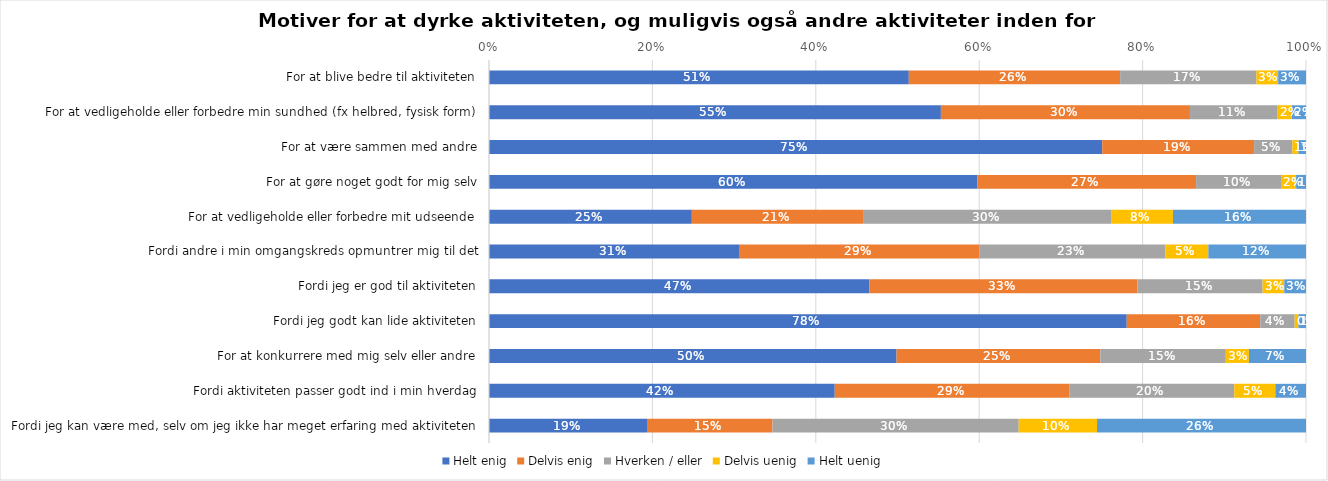
| Category | Helt enig | Delvis enig | Hverken / eller | Delvis uenig | Helt uenig |
|---|---|---|---|---|---|
| For at blive bedre til aktiviteten | 0.514 | 0.259 | 0.167 | 0.027 | 0.034 |
| For at vedligeholde eller forbedre min sundhed (fx helbred, fysisk form) | 0.553 | 0.305 | 0.107 | 0.017 | 0.017 |
| For at være sammen med andre | 0.751 | 0.186 | 0.047 | 0.008 | 0.009 |
| For at gøre noget godt for mig selv | 0.598 | 0.268 | 0.104 | 0.018 | 0.012 |
| For at vedligeholde eller forbedre mit udseende | 0.248 | 0.21 | 0.304 | 0.075 | 0.163 |
| Fordi andre i min omgangskreds opmuntrer mig til det | 0.306 | 0.294 | 0.227 | 0.053 | 0.12 |
| Fordi jeg er god til aktiviteten | 0.465 | 0.329 | 0.153 | 0.027 | 0.027 |
| Fordi jeg godt kan lide aktiviteten | 0.781 | 0.163 | 0.042 | 0.005 | 0.009 |
| For at konkurrere med mig selv eller andre | 0.499 | 0.249 | 0.154 | 0.028 | 0.07 |
| Fordi aktiviteten passer godt ind i min hverdag | 0.423 | 0.288 | 0.202 | 0.05 | 0.038 |
| Fordi jeg kan være med, selv om jeg ikke har meget erfaring med aktiviteten | 0.193 | 0.154 | 0.301 | 0.096 | 0.256 |